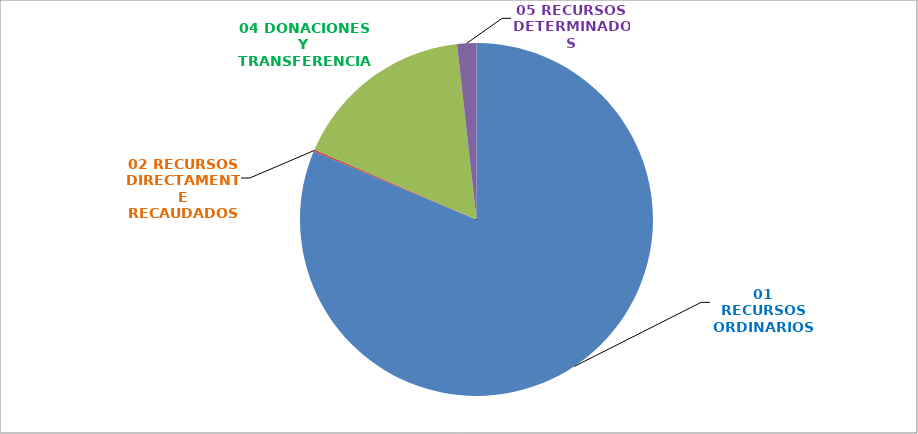
| Category | 445 REGION CAJAMARCA |
|---|---|
| 01 RECURSOS ORDINARIOS | 0.813 |
| 02 RECURSOS DIRECTAMENTE RECAUDADOS | 0.002 |
| 04 DONACIONES Y TRANSFERENCIAS | 0.168 |
| 05 RECURSOS DETERMINADOS | 0.018 |